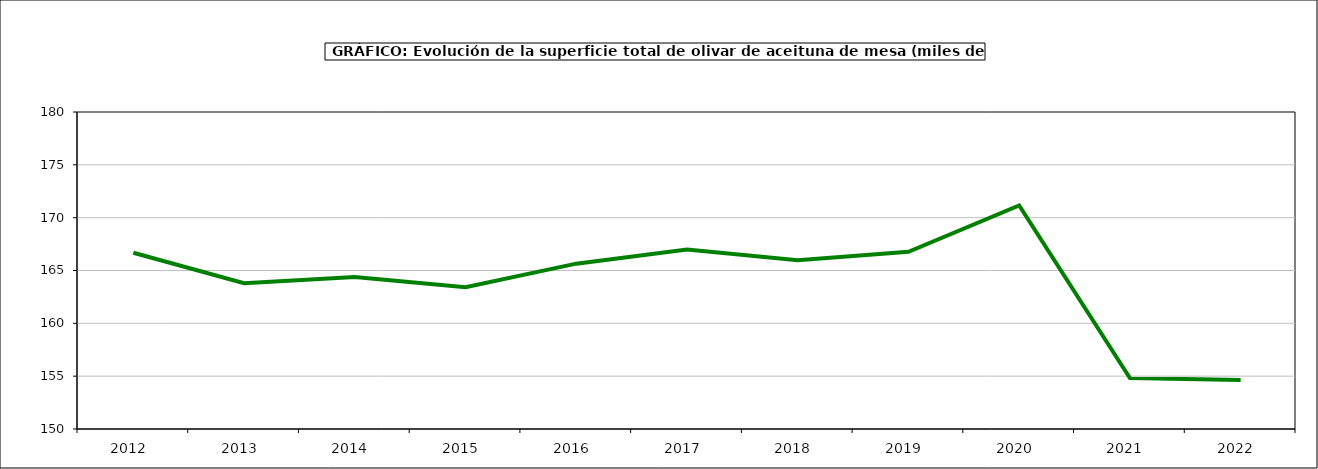
| Category | superficie |
|---|---|
| 2012.0 | 166.679 |
| 2013.0 | 163.795 |
| 2014.0 | 164.379 |
| 2015.0 | 163.414 |
| 2016.0 | 165.647 |
| 2017.0 | 166.997 |
| 2018.0 | 165.98 |
| 2019.0 | 166.774 |
| 2020.0 | 171.152 |
| 2021.0 | 154.825 |
| 2022.0 | 154.643 |